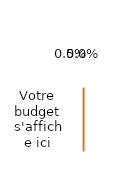
| Category | Series 0 | Series 1 |
|---|---|---|
| Votre budget s'affiche ici | 0.04 | 0.008 |